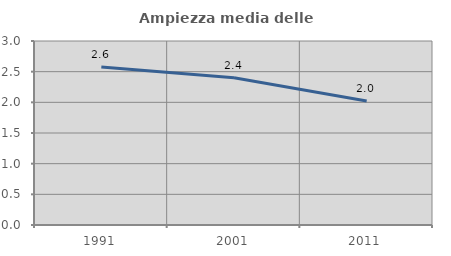
| Category | Ampiezza media delle famiglie |
|---|---|
| 1991.0 | 2.577 |
| 2001.0 | 2.399 |
| 2011.0 | 2.02 |